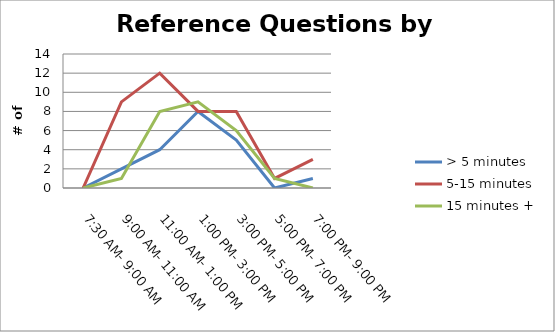
| Category | > 5 minutes | 5-15 minutes | 15 minutes + |
|---|---|---|---|
| 7:30 AM- 9:00 AM | 0 | 0 | 0 |
| 9:00 AM- 11:00 AM | 2 | 9 | 1 |
| 11:00 AM- 1:00 PM | 4 | 12 | 8 |
| 1:00 PM- 3:00 PM | 8 | 8 | 9 |
| 3:00 PM- 5:00 PM | 5 | 8 | 6 |
| 5:00 PM- 7:00 PM | 0 | 1 | 1 |
| 7:00 PM- 9:00 PM | 1 | 3 | 0 |